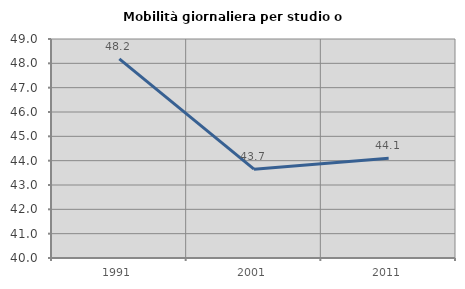
| Category | Mobilità giornaliera per studio o lavoro |
|---|---|
| 1991.0 | 48.186 |
| 2001.0 | 43.652 |
| 2011.0 | 44.099 |